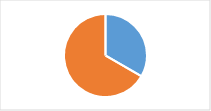
| Category | Section 2 : Mise en œuvre de la LAV |
|---|---|
| 0 | 0.333 |
| 1 | 0.667 |